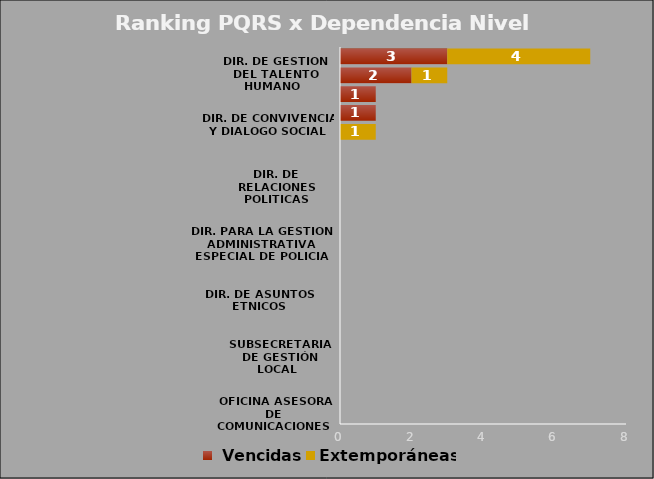
| Category |  Vencidas | Extemporáneas |
|---|---|---|
| OFICINA ASESORA DE COMUNICACIONES  | 0 | 0 |
| OFICINA DE ASUNTOS DISCIPLINARIOS | 0 | 0 |
| SUBSECRETARIA DE GESTIÓN INSTITUCIONAL | 0 | 0 |
| SUBSECRETARIA DE GESTIÓN LOCAL  | 0 | 0 |
| SUBSECRETARIA PARA LA GOBERNABILIDAD Y LA GARANTIA DE DERECHOS | 0 | 0 |
| DIR. JURIDICA | 0 | 0 |
| DIR. DE ASUNTOS ETNICOS | 0 | 0 |
| SUBDIR. DE ASUNTOS INDIGENAS Y RROM | 0 | 0 |
| DIR. DE CONTRATACIÓN | 0 | 0 |
| DIR. PARA LA GESTIÓN ADMINISTRATIVA ESPECIAL DE POLICIA | 0 | 0 |
| DIR. FINANCIERA  | 0 | 0 |
| DIR. DE TECNOLOGIAS E INFORMACIÓN | 0 | 0 |
| DIR. DE RELACIONES POLITICAS | 0 | 0 |
| SUBDIR. DE ASUNTOS DE LIBERTAD RELIGIOSA Y DE CONCIENCIA | 0 | 0 |
| DIR. ADMINISTRATIVA | 0 | 0 |
| DIR. DE CONVIVENCIA Y DIALOGO SOCIAL  | 0 | 1 |
| DIR. PARA LA GESTION DEL DESARROLLO LOCAL | 1 | 0 |
| SUBDIR. DE ASUNTOS PARA COMUNIDADES NEGRAS, AFROCOLOMBIANAS, RAIZALES Y PALENQUERAS | 1 | 0 |
| DIR. DE GESTIÓN DEL TALENTO HUMANO  | 2 | 1 |
| DIR. PARA LA GESTIÓN POLICIVA | 3 | 4 |